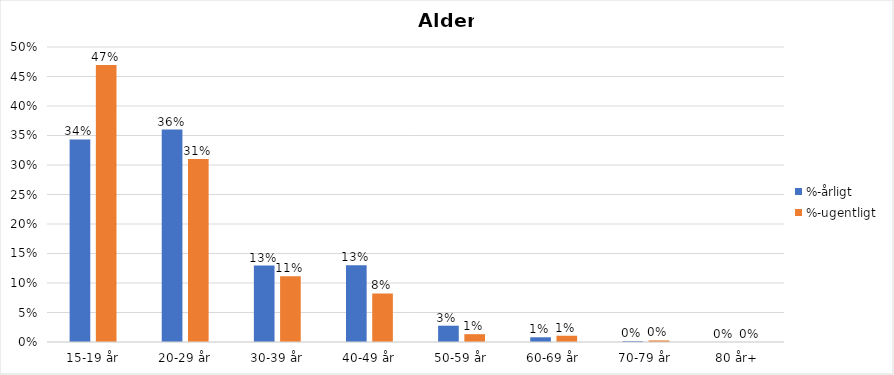
| Category | %-årligt | %-ugentligt |
|---|---|---|
| 15-19 år | 0.343 | 0.469 |
| 20-29 år | 0.36 | 0.31 |
| 30-39 år | 0.129 | 0.111 |
| 40-49 år | 0.13 | 0.082 |
| 50-59 år | 0.028 | 0.013 |
| 60-69 år | 0.008 | 0.011 |
| 70-79 år | 0.001 | 0.003 |
| 80 år+ | 0 | 0 |